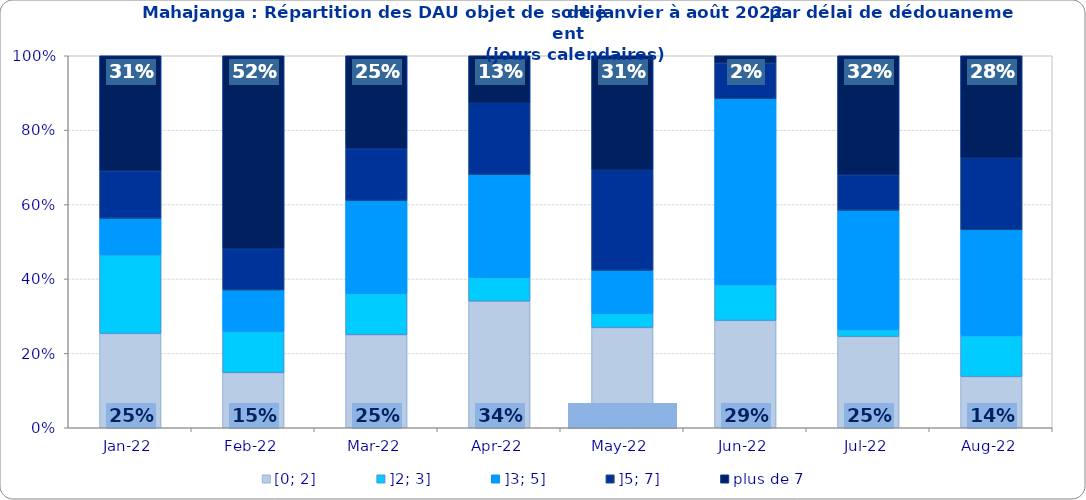
| Category | [0; 2] | ]2; 3] | ]3; 5] | ]5; 7] | plus de 7 |
|---|---|---|---|---|---|
| 2022-01-01 | 0.254 | 0.211 | 0.099 | 0.127 | 0.31 |
| 2022-02-01 | 0.148 | 0.111 | 0.111 | 0.111 | 0.519 |
| 2022-03-01 | 0.25 | 0.111 | 0.25 | 0.139 | 0.25 |
| 2022-04-01 | 0.34 | 0.064 | 0.277 | 0.191 | 0.128 |
| 2022-05-01 | 0.269 | 0.038 | 0.115 | 0.269 | 0.308 |
| 2022-06-01 | 0.288 | 0.096 | 0.5 | 0.096 | 0.019 |
| 2022-07-01 | 0.245 | 0.019 | 0.321 | 0.094 | 0.321 |
| 2022-08-01 | 0.138 | 0.11 | 0.284 | 0.193 | 0.275 |